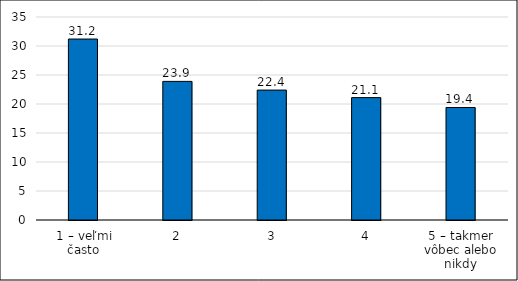
| Category | Series 0 |
|---|---|
| 1 – veľmi často | 31.2 |
| 2 | 23.9 |
| 3 | 22.4 |
| 4 | 21.1 |
| 5 – takmer vôbec alebo nikdy | 19.4 |